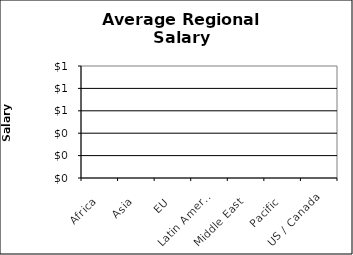
| Category | Total | Selection |
|---|---|---|
| Africa | 0 | 0 |
| Asia | 0 | 0 |
| EU | 0 | 0 |
| Latin America | 0 | 0 |
| Middle East | 0 | 0 |
| Pacific | 0 | 0 |
| US / Canada | 0 | 0 |